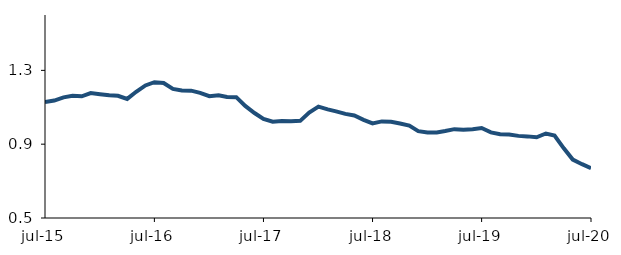
| Category | Series 0 |
|---|---|
| 2015-07-01 | 1.128 |
| 2015-08-01 | 1.136 |
| 2015-09-01 | 1.154 |
| 2015-10-01 | 1.162 |
| 2015-11-01 | 1.159 |
| 2015-12-01 | 1.177 |
| 2016-01-01 | 1.17 |
| 2016-02-01 | 1.165 |
| 2016-03-01 | 1.162 |
| 2016-04-01 | 1.145 |
| 2016-05-01 | 1.184 |
| 2016-06-01 | 1.218 |
| 2016-07-01 | 1.236 |
| 2016-08-01 | 1.232 |
| 2016-09-01 | 1.2 |
| 2016-10-01 | 1.191 |
| 2016-11-01 | 1.19 |
| 2016-12-01 | 1.178 |
| 2017-01-01 | 1.16 |
| 2017-02-01 | 1.166 |
| 2017-03-01 | 1.156 |
| 2017-04-01 | 1.155 |
| 2017-05-01 | 1.107 |
| 2017-06-01 | 1.069 |
| 2017-07-01 | 1.037 |
| 2017-08-01 | 1.021 |
| 2017-09-01 | 1.026 |
| 2017-10-01 | 1.024 |
| 2017-11-01 | 1.026 |
| 2017-12-01 | 1.071 |
| 2018-01-01 | 1.104 |
| 2018-02-01 | 1.088 |
| 2018-03-01 | 1.078 |
| 2018-04-01 | 1.064 |
| 2018-05-01 | 1.056 |
| 2018-06-01 | 1.032 |
| 2018-07-01 | 1.012 |
| 2018-08-01 | 1.024 |
| 2018-09-01 | 1.021 |
| 2018-10-01 | 1.012 |
| 2018-11-01 | 1 |
| 2018-12-01 | 0.97 |
| 2019-01-01 | 0.963 |
| 2019-02-01 | 0.963 |
| 2019-03-01 | 0.971 |
| 2019-04-01 | 0.981 |
| 2019-05-01 | 0.979 |
| 2019-06-01 | 0.981 |
| 2019-07-01 | 0.987 |
| 2019-08-01 | 0.964 |
| 2019-09-01 | 0.954 |
| 2019-10-01 | 0.953 |
| 2019-11-01 | 0.945 |
| 2019-12-01 | 0.942 |
| 2020-01-01 | 0.937 |
| 2020-02-01 | 0.958 |
| 2020-03-01 | 0.947 |
| 2020-04-01 | 0.878 |
| 2020-05-01 | 0.817 |
| 2020-06-01 | 0.792 |
| 2020-07-01 | 0.77 |